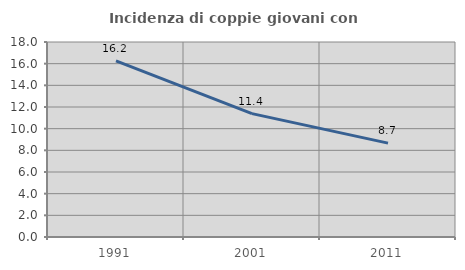
| Category | Incidenza di coppie giovani con figli |
|---|---|
| 1991.0 | 16.249 |
| 2001.0 | 11.388 |
| 2011.0 | 8.668 |